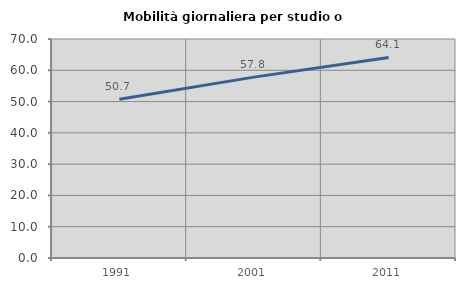
| Category | Mobilità giornaliera per studio o lavoro |
|---|---|
| 1991.0 | 50.722 |
| 2001.0 | 57.818 |
| 2011.0 | 64.114 |